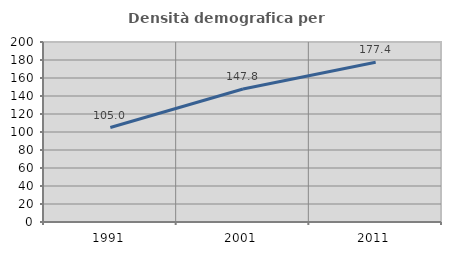
| Category | Densità demografica |
|---|---|
| 1991.0 | 104.988 |
| 2001.0 | 147.845 |
| 2011.0 | 177.446 |